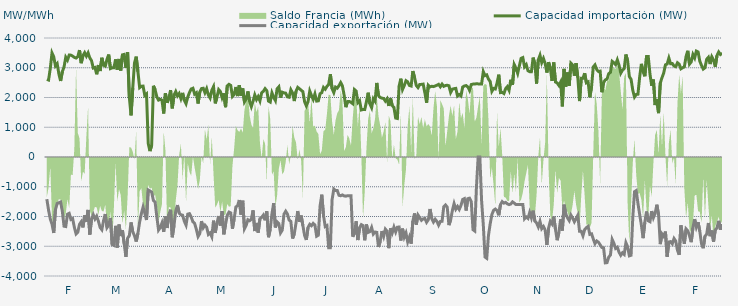
| Category | Capacidad importación (MW) | Capacidad exportación (MW) |
|---|---|---|
| 0 | 2607.375 | -1416.667 |
| 1900-01-01 | 2587.208 | -1789.583 |
| 1900-01-02 | 2978.5 | -2081.25 |
| 1900-01-03 | 3497.083 | -2256.292 |
| 1900-01-04 | 3370 | -2554.542 |
| 1900-01-05 | 3061.75 | -1771.917 |
| 1900-01-06 | 3134.875 | -1562.5 |
| 1900-01-07 | 2789.5 | -1537.5 |
| 1900-01-08 | 2555.75 | -1512.5 |
| 1900-01-09 | 2867.083 | -1825 |
| 1900-01-10 | 3026.833 | -2326.458 |
| 1900-01-11 | 3354.833 | -2337.292 |
| 1900-01-12 | 3258.292 | -1924.167 |
| 1900-01-13 | 3426.125 | -1893.75 |
| 1900-01-14 | 3424.167 | -2100 |
| 1900-01-15 | 3391.208 | -2070.833 |
| 1900-01-16 | 3348.208 | -2362.208 |
| 1900-01-17 | 3325.958 | -2584.917 |
| 1900-01-18 | 3372.292 | -2526.125 |
| 1900-01-19 | 3594.458 | -2261.833 |
| 1900-01-20 | 3154.208 | -2177.542 |
| 1900-01-21 | 3406.542 | -2366 |
| 1900-01-22 | 3506.792 | -1962 |
| 1900-01-23 | 3388.292 | -2170.833 |
| 1900-01-24 | 3502.625 | -1778.917 |
| 1900-01-25 | 3329.875 | -2606.583 |
| 1900-01-26 | 3238.958 | -2081.917 |
| 1900-01-27 | 2990.542 | -1937.25 |
| 1900-01-28 | 3009.542 | -2084.208 |
| 1900-01-29 | 2780.333 | -1987.25 |
| 1900-01-30 | 3090.792 | -2157.25 |
| 1900-01-31 | 2889.375 | -2369.167 |
| 1900-02-01 | 3335.375 | -2443.917 |
| 1900-02-02 | 3086.625 | -2135.417 |
| 1900-02-03 | 3054 | -1916.417 |
| 1900-02-04 | 3285.417 | -2373 |
| 1900-02-05 | 3443.292 | -2289.333 |
| 1900-02-06 | 2971.208 | -2047.917 |
| 1900-02-07 | 2996.292 | -2944.458 |
| 1900-02-08 | 3001.167 | -2971.542 |
| 1900-02-09 | 3281.375 | -2314.833 |
| 1900-02-10 | 2936.042 | -3043.167 |
| 1900-02-11 | 3294.792 | -2270.333 |
| 1900-02-12 | 2907.375 | -2657.667 |
| 1900-02-13 | 3433.583 | -2462.5 |
| 1900-02-14 | 3449.042 | -2914.583 |
| 1900-02-15 | 2992.458 | -3358.458 |
| 1900-02-16 | 3524.375 | -2728.208 |
| 1900-02-17 | 2000 | -2643.375 |
| 1900-02-18 | 1400 | -2200 |
| 1900-02-19 | 2323.375 | -2514.75 |
| 1900-02-20 | 3160.167 | -2645.333 |
| 1900-02-21 | 3372.083 | -2842.167 |
| 1900-02-22 | 2865.739 | -2564.565 |
| 1900-02-23 | 2332.667 | -2181.833 |
| 1900-02-24 | 2376.083 | -1906.25 |
| 1900-02-25 | 2381.25 | -1683.333 |
| 1900-02-26 | 2070.833 | -1891.667 |
| 1900-02-27 | 2120.083 | -2118.75 |
| 1900-02-28 | 449.25 | -1108.333 |
| 1900-02-28 | 200 | -1139.583 |
| 1900-03-01 | 395.833 | -1179.167 |
| 1900-03-02 | 2393.75 | -1462.5 |
| 1900-03-03 | 2262.25 | -1512.5 |
| 1900-03-04 | 2020.833 | -2007.167 |
| 1900-03-05 | 1912.5 | -2455.208 |
| 1900-03-06 | 1939.583 | -2371.125 |
| 1900-03-07 | 1908.333 | -2217.958 |
| 1900-03-08 | 1462.5 | -2517.542 |
| 1900-03-09 | 2145.208 | -2000.417 |
| 1900-03-10 | 1820.833 | -2386.167 |
| 1900-03-11 | 1983.333 | -1930.75 |
| 1900-03-12 | 2245.833 | -1772.917 |
| 1900-03-13 | 1635.417 | -2697.5 |
| 1900-03-14 | 2079.167 | -2299.625 |
| 1900-03-15 | 2200 | -1818.75 |
| 1900-03-16 | 2052.083 | -1616.667 |
| 1900-03-17 | 2133.333 | -1885.417 |
| 1900-03-18 | 1962.5 | -1940.792 |
| 1900-03-19 | 2154.167 | -1955.875 |
| 1900-03-20 | 1906.25 | -2160.458 |
| 1900-03-21 | 1791.667 | -2289.583 |
| 1900-03-22 | 2014.583 | -1920.333 |
| 1900-03-23 | 2166.667 | -1904.167 |
| 1900-03-24 | 2285.417 | -2016.25 |
| 1900-03-25 | 2310.417 | -2177.917 |
| 1900-03-26 | 2114.583 | -2230.875 |
| 1900-03-27 | 2160.417 | -2431.625 |
| 1900-03-28 | 1797.917 | -2674.417 |
| 1900-03-29 | 2180.625 | -2574 |
| 1900-03-30 | 2300 | -2155.333 |
| 1900-03-31 | 2310.417 | -2380.708 |
| 1900-04-01 | 2160.417 | -2290.5 |
| 1900-04-02 | 2295.833 | -2360.958 |
| 1900-04-03 | 2083.333 | -2603 |
| 1900-04-04 | 1983.333 | -2551.458 |
| 1900-04-05 | 2243.75 | -2680.375 |
| 1900-04-06 | 2364.583 | -2139.583 |
| 1900-04-07 | 1802.083 | -2551.375 |
| 1900-04-08 | 2012.5 | -2222.583 |
| 1900-04-09 | 2264.583 | -1983.333 |
| 1900-04-10 | 2200 | -2304.167 |
| 1900-04-11 | 1991.667 | -1823 |
| 1900-04-12 | 2139.583 | -2598.667 |
| 1900-04-13 | 1674.583 | -2262.5 |
| 1900-04-14 | 2391.667 | -1958.333 |
| 1900-04-15 | 2442.875 | -1852.083 |
| 1900-04-16 | 2406.25 | -1879.167 |
| 1900-04-17 | 2035.417 | -2408.5 |
| 1900-04-18 | 2093.75 | -2077.083 |
| 1900-04-19 | 2353.042 | -1679.167 |
| 1900-04-20 | 2047.917 | -1637.5 |
| 1900-04-21 | 2414.917 | -1445.833 |
| 1900-04-22 | 2054.167 | -1935.417 |
| 1900-04-23 | 2304.167 | -1468.75 |
| 1900-04-24 | 1852.083 | -2413.583 |
| 1900-04-25 | 1950 | -2298.583 |
| 1900-04-26 | 2204.167 | -2108.333 |
| 1900-04-27 | 1870.833 | -2142.875 |
| 1900-04-28 | 1693.75 | -2094.083 |
| 1900-04-29 | 1875 | -1793.75 |
| 1900-04-30 | 2087.5 | -2489.25 |
| 1900-05-01 | 1929.167 | -2216.167 |
| 1900-05-02 | 2031.25 | -2542 |
| 1900-05-03 | 1885.417 | -2072.833 |
| 1900-05-04 | 2156.25 | -2029.167 |
| 1900-05-05 | 2208.333 | -1953 |
| 1900-05-06 | 2297.917 | -2127.083 |
| 1900-05-07 | 2229.167 | -1822.917 |
| 1900-05-08 | 1879.167 | -2695.583 |
| 1900-05-09 | 1845.833 | -2427.667 |
| 1900-05-10 | 2156.25 | -1908.417 |
| 1900-05-11 | 2010.417 | -1551.375 |
| 1900-05-12 | 1897.625 | -2367.333 |
| 1900-05-13 | 2291.667 | -2179.167 |
| 1900-05-14 | 2358.333 | -2236.833 |
| 1900-05-15 | 1997.917 | -2551.708 |
| 1900-05-16 | 2179.167 | -2457.875 |
| 1900-05-17 | 2156.25 | -1922.667 |
| 1900-05-18 | 2145.833 | -1823.917 |
| 1900-05-19 | 2022.917 | -1916.417 |
| 1900-05-20 | 2008.333 | -2121.167 |
| 1900-05-21 | 2260.417 | -2164.667 |
| 1900-05-22 | 2152.083 | -2739.958 |
| 1900-05-23 | 1881 | -2582.833 |
| 1900-05-24 | 2206.25 | -2222.083 |
| 1900-05-25 | 2339.583 | -1816.667 |
| 1900-05-26 | 2293.75 | -2177.833 |
| 1900-05-27 | 2245.833 | -1968.75 |
| 1900-05-28 | 2195.833 | -2304.458 |
| 1900-05-29 | 1858.208 | -2638.917 |
| 1900-05-30 | 1718.75 | -2788.083 |
| 1900-05-31 | 1858.333 | -2369.542 |
| 1900-06-01 | 2216.667 | -2260.583 |
| 1900-06-02 | 2066.667 | -2309.375 |
| 1900-06-03 | 1935.417 | -2231 |
| 1900-06-04 | 2118.292 | -2285.25 |
| 1900-06-05 | 1879.583 | -2663 |
| 1900-06-06 | 1887.5 | -2627.5 |
| 1900-06-07 | 2127.083 | -1647.917 |
| 1900-06-08 | 2162.5 | -1266.667 |
| 1900-06-09 | 2338.667 | -1964.583 |
| 1900-06-10 | 2277.083 | -2337.25 |
| 1900-06-11 | 2373.75 | -2304.167 |
| 1900-06-12 | 2435.083 | -3048.333 |
| 1900-06-13 | 2780.708 | -3048.208 |
| 1900-06-14 | 2300 | -1435 |
| 1900-06-15 | 2164.583 | -1077.083 |
| 1900-06-16 | 2350 | -1125 |
| 1900-06-17 | 2314.583 | -1125 |
| 1900-06-18 | 2395.625 | -1287.5 |
| 1900-06-19 | 2501.583 | -1302.083 |
| 1900-06-20 | 2389.417 | -1275 |
| 1900-06-21 | 2080.375 | -1308.333 |
| 1900-06-22 | 1675 | -1316.667 |
| 1900-06-23 | 1862.5 | -1300 |
| 1900-06-24 | 1866.708 | -1300 |
| 1900-06-25 | 1837.292 | -1300 |
| 1900-06-26 | 1793.75 | -2680.333 |
| 1900-06-27 | 2268.333 | -2563.75 |
| 1900-06-28 | 2217.333 | -2160.333 |
| 1900-06-29 | 1831.25 | -2791.75 |
| 1900-06-30 | 1890.083 | -2386.583 |
| 1900-07-01 | 1581.667 | -2273.25 |
| 1900-07-02 | 1595.833 | -2304.167 |
| 1900-07-03 | 1593.75 | -2799.042 |
| 1900-07-04 | 1860.75 | -2268.667 |
| 1900-07-05 | 2160.5 | -2533.875 |
| 1900-07-06 | 1785.417 | -2508.667 |
| 1900-07-07 | 1658.333 | -2368.167 |
| 1900-07-08 | 1958.333 | -2590.5 |
| 1900-07-09 | 1875.083 | -2522 |
| 1900-07-10 | 2489.792 | -2532.75 |
| 1900-07-11 | 2064.583 | -3024.833 |
| 1900-07-12 | 2001.333 | -2838.125 |
| 1900-07-13 | 1979.167 | -2490.417 |
| 1900-07-14 | 1966.667 | -2671.375 |
| 1900-07-15 | 1877.792 | -2424.333 |
| 1900-07-16 | 1957.75 | -2493.167 |
| 1900-07-17 | 1716.667 | -3063.708 |
| 1900-07-18 | 1978.5 | -2394.708 |
| 1900-07-19 | 1729.167 | -2549 |
| 1900-07-20 | 1666.667 | -2355.5 |
| 1900-07-21 | 1308.333 | -2520.458 |
| 1900-07-22 | 1293.75 | -2359.417 |
| 1900-07-23 | 2383.833 | -2353.167 |
| 1900-07-24 | 2632.25 | -2807.083 |
| 1900-07-25 | 2269.167 | -2407.042 |
| 1900-07-26 | 2400.75 | -2695.042 |
| 1900-07-27 | 2564.417 | -2553.583 |
| 1900-07-28 | 2525.583 | -2853.583 |
| 1900-07-29 | 2404.5 | -2690.292 |
| 1900-07-30 | 2386.042 | -2912.083 |
| 1900-07-31 | 2890.042 | -2155.708 |
| 1900-08-01 | 2668.625 | -1896.5 |
| 1900-08-02 | 2403.083 | -2272.75 |
| 1900-08-03 | 2332.833 | -1950 |
| 1900-08-04 | 2437.5 | -2037.5 |
| 1900-08-05 | 2441.667 | -2129 |
| 1900-08-06 | 2450 | -2079.167 |
| 1900-08-07 | 2159.292 | -2066.667 |
| 1900-08-08 | 1825 | -2195.667 |
| 1900-08-09 | 2412.5 | -2108.333 |
| 1900-08-10 | 2355.5 | -1747.917 |
| 1900-08-11 | 2377.083 | -2070.833 |
| 1900-08-12 | 2366.667 | -2185.333 |
| 1900-08-13 | 2387.5 | -2091.667 |
| 1900-08-14 | 2412.5 | -2164.583 |
| 1900-08-15 | 2443 | -2291.292 |
| 1900-08-16 | 2360.417 | -2168.75 |
| 1900-08-17 | 2450 | -2160.417 |
| 1900-08-18 | 2375 | -1668.75 |
| 1900-08-19 | 2402.083 | -1612.5 |
| 1900-08-20 | 2412 | -1683.333 |
| 1900-08-21 | 2393.75 | -2289.583 |
| 1900-08-22 | 2168.625 | -2114.083 |
| 1900-08-23 | 2281.25 | -1800 |
| 1900-08-24 | 2295.833 | -1566.667 |
| 1900-08-25 | 2306.25 | -1754.167 |
| 1900-08-26 | 2050 | -1662.5 |
| 1900-08-27 | 2100 | -1762.5 |
| 1900-08-28 | 2052.083 | -1629.167 |
| 1900-08-29 | 2351.708 | -1429.167 |
| 1900-08-30 | 2387.5 | -1400 |
| 1900-08-31 | 2400 | -1800 |
| 1900-09-01 | 2355.875 | -1400 |
| 1900-09-02 | 2239.583 | -1383.333 |
| 1900-09-03 | 2435.417 | -1500 |
| 1900-09-04 | 2450 | -2442.875 |
| 1900-09-05 | 2455.875 | -2487.042 |
| 1900-09-06 | 2459.792 | -1025 |
| 1900-09-07 | 2457.708 | 0 |
| 1900-09-08 | 2450 | 0 |
| 1900-09-09 | 2450 | -1462.5 |
| 1900-09-10 | 2870.833 | -2280.5 |
| 1900-09-11 | 2735.958 | -3362.458 |
| 1900-09-12 | 2761.833 | -3404.708 |
| 1900-09-13 | 2618.708 | -2638.958 |
| 1900-09-14 | 2538.583 | -2247.25 |
| 1900-09-15 | 2208.333 | -1933.333 |
| 1900-09-16 | 2304.167 | -1791.667 |
| 1900-09-17 | 2285.083 | -1750 |
| 1900-09-18 | 2485.708 | -1800 |
| 1900-09-19 | 2766.917 | -1958.333 |
| 1900-09-20 | 2164.458 | -1600 |
| 1900-09-21 | 2172.792 | -1500 |
| 1900-09-22 | 2133.333 | -1550 |
| 1900-09-23 | 2297.917 | -1525 |
| 1900-09-24 | 2366.667 | -1575 |
| 1900-09-25 | 2243.25 | -1600 |
| 1900-09-26 | 2598.52 | -1580 |
| 1900-09-27 | 2420.167 | -1508.333 |
| 1900-09-28 | 3106.25 | -1550 |
| 1900-09-29 | 2984.667 | -1600 |
| 1900-09-30 | 2812.083 | -1600 |
| 1900-10-01 | 3067.5 | -1600 |
| 1900-10-02 | 3316.25 | -1600 |
| 1900-10-03 | 3341.25 | -1600 |
| 1900-10-04 | 3032 | -2077.083 |
| 1900-10-05 | 3104.417 | -2016.75 |
| 1900-10-06 | 2900 | -2064.583 |
| 1900-10-07 | 2867 | -1862.5 |
| 1900-10-08 | 2867 | -2045.833 |
| 1900-10-09 | 3341.083 | -1804.167 |
| 1900-10-10 | 3131.083 | -2154.167 |
| 1900-10-11 | 2468.083 | -2216.667 |
| 1900-10-12 | 3265.167 | -2350 |
| 1900-10-13 | 3420.583 | -2164.833 |
| 1900-10-14 | 3174.333 | -2409.417 |
| 1900-10-15 | 3313.292 | -2335.75 |
| 1900-10-16 | 3146.333 | -2455.542 |
| 1900-10-17 | 2838 | -2955.75 |
| 1900-10-18 | 3188.5 | -2388.25 |
| 1900-10-19 | 2992.083 | -2162.5 |
| 1900-10-20 | 2556.125 | -2248.583 |
| 1900-10-21 | 3177.25 | -2002.917 |
| 1900-10-22 | 2521.083 | -2429.667 |
| 1900-10-23 | 2489.167 | -2797.208 |
| 1900-10-24 | 2404.583 | -2531.417 |
| 1900-10-25 | 2519.708 | -2094.75 |
| 1900-10-26 | 1700 | -2472.792 |
| 1900-10-27 | 2961.583 | -1602.083 |
| 1900-10-28 | 2367.125 | -1916.667 |
| 1900-10-29 | 2839.792 | -2043.75 |
| 1900-10-30 | 2395.833 | -2137.5 |
| 1900-10-31 | 3152.583 | -1952.083 |
| 1900-11-01 | 3090.75 | -2052.083 |
| 1900-11-02 | 2732.167 | -2177.083 |
| 1900-11-03 | 3154.208 | -2069.625 |
| 1900-11-04 | 2672.375 | -1960.417 |
| 1900-11-05 | 1879.167 | -2497 |
| 1900-11-06 | 2643.583 | -2497 |
| 1900-11-07 | 2643.083 | -2647.583 |
| 1900-11-08 | 2816.917 | -2441.083 |
| 1900-11-09 | 2493.125 | -2374 |
| 1900-11-10 | 2524.458 | -2332.167 |
| 1900-11-11 | 2008.333 | -2601 |
| 1900-11-12 | 2361.875 | -2582.083 |
| 1900-11-13 | 3027.625 | -2755.833 |
| 1900-11-14 | 3096.375 | -2911.667 |
| 1900-11-15 | 2940.417 | -2822.917 |
| 1900-11-16 | 2875 | -2863.5 |
| 1900-11-17 | 2886.833 | -2951.167 |
| 1900-11-18 | 2177.083 | -3040.5 |
| 1900-11-19 | 2503.583 | -3052 |
| 1900-11-20 | 2591.792 | -3558.75 |
| 1900-11-21 | 2617 | -3551.083 |
| 1900-11-22 | 2801.958 | -3364.542 |
| 1900-11-23 | 2846.25 | -3293 |
| 1900-11-24 | 3214.542 | -2770.875 |
| 1900-11-25 | 3169.167 | -2897.917 |
| 1900-11-26 | 3108.042 | -3073.375 |
| 1900-11-27 | 3266.042 | -3032.75 |
| 1900-11-28 | 3083.708 | -3200.292 |
| 1900-11-29 | 2817.875 | -3304.5 |
| 1900-11-30 | 2919.708 | -3219.583 |
| 1900-12-01 | 2976.042 | -3273.667 |
| 1900-12-02 | 3445.625 | -2880.583 |
| 1900-12-03 | 3231.042 | -3016.625 |
| 1900-12-04 | 2703.75 | -3322.875 |
| 1900-12-05 | 2610.417 | -3303 |
| 1900-12-06 | 2240.75 | -2035 |
| 1900-12-07 | 2016.667 | -1167.583 |
| 1900-12-08 | 2102.083 | -1128.25 |
| 1900-12-09 | 2110.417 | -1558.333 |
| 1900-12-10 | 2691.083 | -1930.667 |
| 1900-12-11 | 3131 | -2286.417 |
| 1900-12-12 | 2867 | -2728 |
| 1900-12-13 | 2713.167 | -2194.5 |
| 1900-12-14 | 3375.5 | -1833.333 |
| 1900-12-15 | 3377.833 | -2144.5 |
| 1900-12-16 | 2788.375 | -2175 |
| 1900-12-17 | 2393.917 | -1818.5 |
| 1900-12-18 | 2602.208 | -2041.542 |
| 1900-12-19 | 1745.833 | -1898.542 |
| 1900-12-20 | 1941.667 | -1603.542 |
| 1900-12-21 | 1475 | -1942.833 |
| 1900-12-22 | 2488.208 | -2928.792 |
| 1900-12-23 | 2665.583 | -2587.083 |
| 1900-12-24 | 2824.833 | -2666.708 |
| 1900-12-25 | 3099 | -2507.042 |
| 1900-12-26 | 3125.208 | -3352.792 |
| 1900-12-27 | 3325.625 | -2855.792 |
| 1900-12-28 | 3135.042 | -2844.083 |
| 1900-12-29 | 3141.667 | -2918 |
| 1900-12-30 | 3059.917 | -2739.5 |
| 1900-12-31 | 3034.833 | -2828 |
| 1901-01-01 | 3167.5 | -3136.792 |
| 1901-01-02 | 3121.167 | -3287.208 |
| 1901-01-03 | 2964.583 | -2300 |
| 1901-01-04 | 3002.167 | -2654.417 |
| 1901-01-05 | 3029.042 | -2917.583 |
| 1901-01-06 | 3379.625 | -2416.083 |
| 1901-01-07 | 3570.333 | -2480.292 |
| 1901-01-08 | 3123.292 | -2647.208 |
| 1901-01-09 | 3196.583 | -2862.417 |
| 1901-01-10 | 3445.458 | -2378.958 |
| 1901-01-11 | 3328.083 | -2087.5 |
| 1901-01-12 | 3561 | -2358.667 |
| 1901-01-13 | 3532.125 | -2190.458 |
| 1901-01-14 | 3219.792 | -2497 |
| 1901-01-15 | 3077.292 | -2917.833 |
| 1901-01-16 | 2955.75 | -3065.375 |
| 1901-01-17 | 2997.958 | -2665.292 |
| 1901-01-18 | 3285.292 | -2594.75 |
| 1901-01-19 | 3350.708 | -2217.75 |
| 1901-01-20 | 3125.292 | -2661.542 |
| 1901-01-21 | 3368.292 | -2470.583 |
| 1901-01-22 | 3260.167 | -2844.375 |
| 1901-01-23 | 3034.708 | -2450.625 |
| 1901-01-24 | 3410.458 | -2385 |
| 1901-01-25 | 3529.958 | -2146.167 |
| 1901-01-26 | 3445.25 | -2443.125 |
| 1901-01-27 | 3489.542 | -2260.25 |